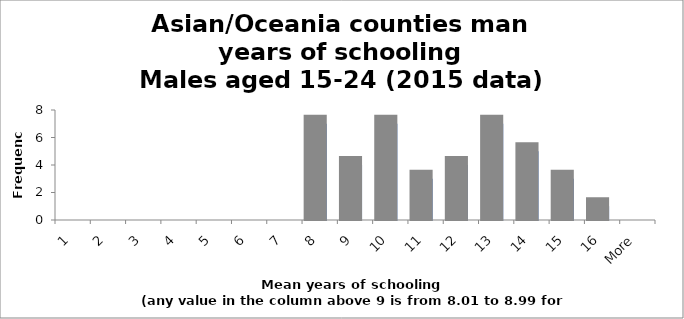
| Category | Frequency |
|---|---|
| 1 | 0 |
| 2 | 0 |
| 3 | 0 |
| 4 | 0 |
| 5 | 0 |
| 6 | 0 |
| 7 | 0 |
| 8 | 7 |
| 9 | 4 |
| 10 | 7 |
| 11 | 3 |
| 12 | 4 |
| 13 | 7 |
| 14 | 5 |
| 15 | 3 |
| 16 | 1 |
| More | 0 |